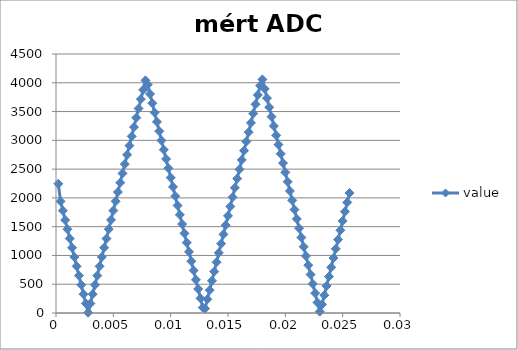
| Category | value |
|---|---|
| 0.0002 | 2245 |
| 0.0004 | 1939 |
| 0.0006 | 1778 |
| 0.0008 | 1615 |
| 0.001 | 1455 |
| 0.0012 | 1294 |
| 0.0014 | 1133 |
| 0.0016 | 972 |
| 0.0018 | 811 |
| 0.002 | 649 |
| 0.0022 | 489 |
| 0.0024 | 326 |
| 0.0026 | 166 |
| 0.0028 | 6 |
| 0.003 | 165 |
| 0.0032 | 328 |
| 0.0034 | 488 |
| 0.0036 | 649 |
| 0.0038 | 811 |
| 0.004 | 973 |
| 0.0042 | 1134 |
| 0.0044 | 1293 |
| 0.0046 | 1456 |
| 0.0048 | 1617 |
| 0.005 | 1779 |
| 0.0052 | 1940 |
| 0.0054 | 2102 |
| 0.0056 | 2264 |
| 0.0058 | 2425 |
| 0.006 | 2587 |
| 0.0062 | 2748 |
| 0.0064 | 2908 |
| 0.0066 | 3069 |
| 0.0068 | 3231 |
| 0.007 | 3393 |
| 0.0072 | 3553 |
| 0.0074 | 3716 |
| 0.0076 | 3877 |
| 0.0078 | 4041 |
| 0.008 | 3968 |
| 0.0082 | 3805 |
| 0.0084 | 3645 |
| 0.0086 | 3482 |
| 0.0088 | 3321 |
| 0.009 | 3160 |
| 0.0092 | 2997 |
| 0.0094 | 2836 |
| 0.0096 | 2676 |
| 0.0098 | 2515 |
| 0.01 | 2352 |
| 0.0102 | 2191 |
| 0.0104 | 2030 |
| 0.0106 | 1868 |
| 0.0108 | 1706 |
| 0.011 | 1545 |
| 0.0112 | 1383 |
| 0.0114 | 1222 |
| 0.0116 | 1063 |
| 0.0118 | 900 |
| 0.012 | 740 |
| 0.0122 | 577 |
| 0.0124 | 418 |
| 0.0126 | 255 |
| 0.0128 | 95 |
| 0.013 | 76 |
| 0.0132 | 237 |
| 0.0134 | 397 |
| 0.0136 | 559 |
| 0.0138 | 720 |
| 0.014 | 882 |
| 0.0142 | 1045 |
| 0.0144 | 1205 |
| 0.0146 | 1366 |
| 0.0148 | 1527 |
| 0.015 | 1689 |
| 0.0152 | 1850 |
| 0.0154 | 2011 |
| 0.0156 | 2175 |
| 0.0158 | 2334 |
| 0.016 | 2496 |
| 0.0162 | 2659 |
| 0.0164 | 2820 |
| 0.0166 | 2978 |
| 0.0168 | 3142 |
| 0.017 | 3303 |
| 0.0172 | 3465 |
| 0.0174 | 3626 |
| 0.0176 | 3788 |
| 0.0178 | 3950 |
| 0.018 | 4058 |
| 0.0182 | 3895 |
| 0.0184 | 3733 |
| 0.0186 | 3574 |
| 0.0188 | 3411 |
| 0.019 | 3249 |
| 0.0192 | 3088 |
| 0.0194 | 2926 |
| 0.0196 | 2765 |
| 0.0198 | 2605 |
| 0.02 | 2443 |
| 0.0202 | 2281 |
| 0.0204 | 2120 |
| 0.0206 | 1957 |
| 0.0208 | 1796 |
| 0.021 | 1634 |
| 0.0212 | 1473 |
| 0.0214 | 1312 |
| 0.0216 | 1151 |
| 0.0218 | 990 |
| 0.022 | 830 |
| 0.0222 | 668 |
| 0.0224 | 506 |
| 0.0226 | 345 |
| 0.0228 | 183 |
| 0.023 | 23 |
| 0.0232 | 148 |
| 0.0234 | 309 |
| 0.0236 | 471 |
| 0.0238 | 632 |
| 0.024 | 793 |
| 0.0242 | 956 |
| 0.0244 | 1115 |
| 0.0246 | 1275 |
| 0.0248 | 1437 |
| 0.025 | 1599 |
| 0.0252 | 1760 |
| 0.0254 | 1922 |
| 0.0256 | 2085 |